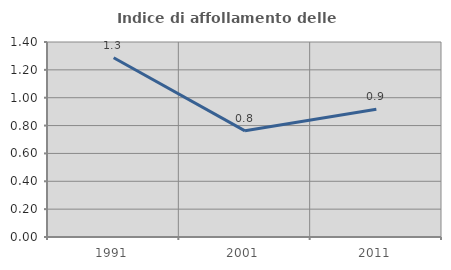
| Category | Indice di affollamento delle abitazioni  |
|---|---|
| 1991.0 | 1.287 |
| 2001.0 | 0.762 |
| 2011.0 | 0.917 |